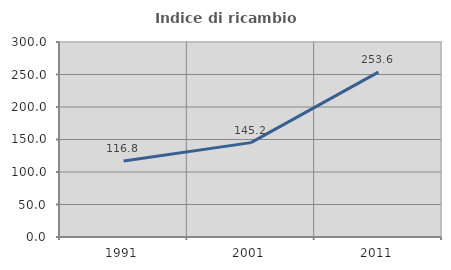
| Category | Indice di ricambio occupazionale  |
|---|---|
| 1991.0 | 116.8 |
| 2001.0 | 145.205 |
| 2011.0 | 253.623 |